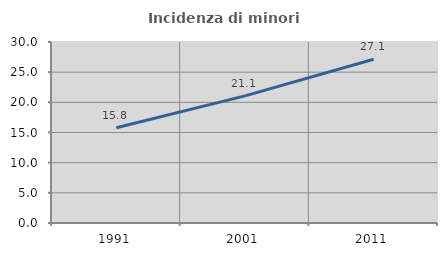
| Category | Incidenza di minori stranieri |
|---|---|
| 1991.0 | 15.789 |
| 2001.0 | 21.073 |
| 2011.0 | 27.133 |